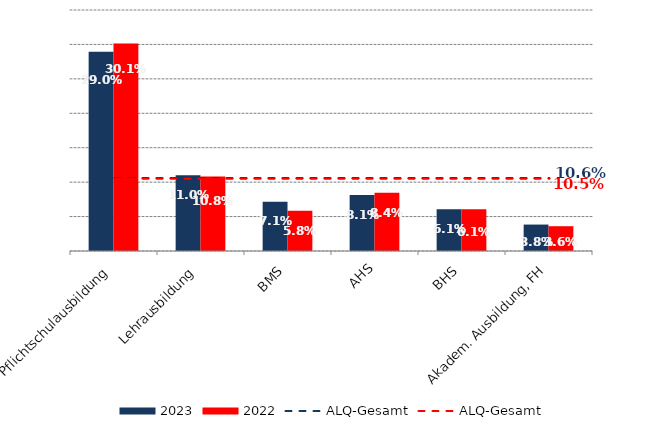
| Category | 2023 | 2022 |
|---|---|---|
| Pflichtschulausbildung | 0.29 | 0.301 |
| Lehrausbildung | 0.11 | 0.108 |
| BMS | 0.071 | 0.058 |
| AHS | 0.081 | 0.084 |
| BHS | 0.061 | 0.061 |
| Akadem. Ausbildung, FH | 0.038 | 0.036 |